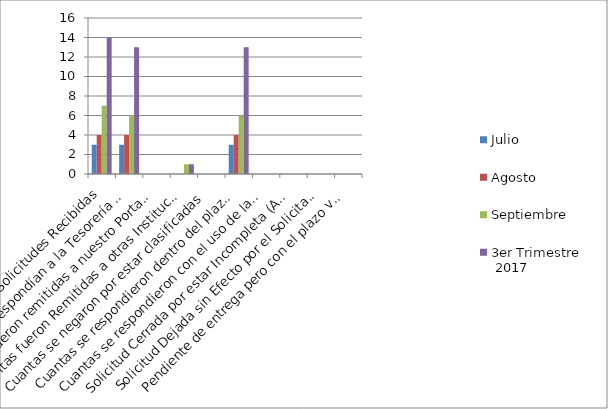
| Category | Julio | Agosto | Septiembre | 3er Trimestre
 2017 |
|---|---|---|---|---|
| Total de Solicitudes Recibidas | 3 | 4 | 7 | 14 |
| Cuantas le correspondían a la Tesorería Nacional | 3 | 4 | 6 | 13 |
| Cuantas fueron remitidas a nuestro Portal Web | 0 | 0 | 0 | 0 |
| Cuantas fueron Remitidas a otras Instituciones | 0 | 0 | 1 | 1 |
| Cuantas se negaron por estar clasificadas | 0 | 0 | 0 | 0 |
| Cuantas se respondieron dentro del plazo de los 15 días laborables | 3 | 4 | 6 | 13 |
| Cuantas se respondieron con el uso de la prórroga de 10 días | 0 | 0 | 0 | 0 |
| Solicitud Cerrada por estar Incompleta (Art. 17,Reglamento 130-05) | 0 | 0 | 0 | 0 |
| Solicitud Dejada sin Efecto por el Solicitante | 0 | 0 | 0 | 0 |
| Pendiente de entrega pero con el plazo vigente | 0 | 0 | 0 | 0 |